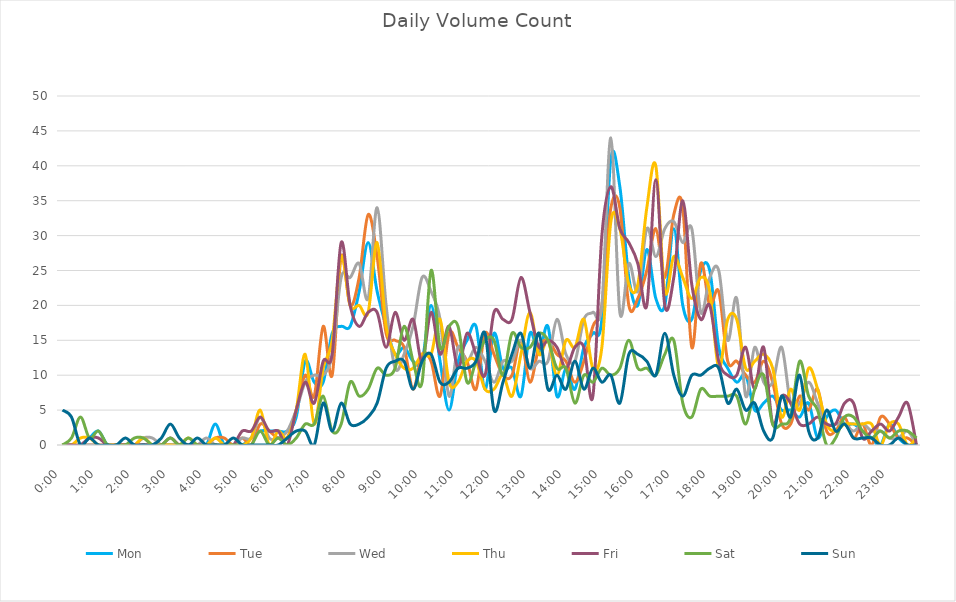
| Category | Mon | Tue | Wed | Thu | Fri | Sat | Sun |
|---|---|---|---|---|---|---|---|
| 0.0 | 0 | 0 | 0 | 0 | 0 | 0 | 5 |
| 0.010416666666666666 | 0 | 0 | 0 | 0 | 0 | 1 | 4 |
| 0.020833333333333332 | 0 | 0 | 0 | 1 | 0 | 4 | 0 |
| 0.03125 | 1 | 0 | 0 | 1 | 1 | 1 | 1 |
| 0.041666666666666664 | 2 | 0 | 0 | 0 | 1 | 2 | 0 |
| 0.05208333333333333 | 0 | 0 | 0 | 0 | 0 | 0 | 0 |
| 0.06249999999999999 | 0 | 0 | 0 | 0 | 0 | 0 | 0 |
| 0.07291666666666666 | 0 | 0 | 0 | 0 | 0 | 0 | 1 |
| 0.08333333333333333 | 0 | 0 | 0 | 0 | 0 | 1 | 0 |
| 0.09375 | 0 | 0 | 1 | 1 | 0 | 1 | 0 |
| 0.10416666666666667 | 0 | 0 | 1 | 0 | 0 | 0 | 0 |
| 0.11458333333333334 | 0 | 0 | 0 | 0 | 0 | 0 | 1 |
| 0.125 | 0 | 0 | 0 | 0 | 1 | 1 | 3 |
| 0.13541666666666666 | 0 | 0 | 0 | 0 | 0 | 0 | 1 |
| 0.14583333333333331 | 0 | 0 | 0 | 1 | 0 | 1 | 0 |
| 0.15624999999999997 | 0 | 0 | 0 | 0 | 0 | 0 | 1 |
| 0.16666666666666663 | 0 | 0 | 1 | 0 | 0 | 0 | 0 |
| 0.1770833333333333 | 3 | 1 | 0 | 1 | 0 | 0 | 0 |
| 0.18749999999999994 | 0 | 1 | 0 | 0 | 0 | 0 | 0 |
| 0.1979166666666666 | 0 | 0 | 0 | 0 | 0 | 0 | 1 |
| 0.20833333333333326 | 0 | 1 | 1 | 0 | 2 | 0 | 0 |
| 0.21874999999999992 | 1 | 0 | 1 | 1 | 2 | 0 | 0 |
| 0.22916666666666657 | 2 | 3 | 4 | 5 | 4 | 2 | 0 |
| 0.23958333333333323 | 2 | 2 | 1 | 0 | 2 | 0 | 0 |
| 0.2499999999999999 | 2 | 1 | 1 | 2 | 2 | 1 | 0 |
| 0.2604166666666666 | 2 | 1 | 2 | 1 | 0 | 0 | 1 |
| 0.27083333333333326 | 4 | 5 | 5 | 5 | 5 | 1 | 2 |
| 0.28124999999999994 | 12 | 10 | 9 | 13 | 9 | 3 | 2 |
| 0.29166666666666663 | 9 | 7 | 10 | 3 | 6 | 3 | 0 |
| 0.3020833333333333 | 9 | 17 | 10 | 11 | 12 | 7 | 6 |
| 0.3125 | 16 | 10 | 13 | 15 | 13 | 2 | 2 |
| 0.3229166666666667 | 17 | 27 | 24 | 27 | 29 | 3 | 6 |
| 0.33333333333333337 | 17 | 20 | 24 | 20 | 20 | 9 | 3 |
| 0.34375000000000006 | 22 | 24 | 26 | 20 | 17 | 7 | 3 |
| 0.35416666666666674 | 29 | 33 | 21 | 19 | 19 | 8 | 4 |
| 0.3645833333333334 | 22 | 27 | 34 | 29 | 19 | 11 | 6 |
| 0.3750000000000001 | 17 | 16 | 20 | 17 | 14 | 10 | 11 |
| 0.3854166666666668 | 13 | 15 | 11 | 13 | 19 | 11 | 12 |
| 0.3958333333333335 | 14 | 14 | 13 | 11 | 15 | 17 | 12 |
| 0.40625000000000017 | 12 | 8 | 17 | 11 | 18 | 12 | 8 |
| 0.41666666666666685 | 12 | 13 | 24 | 13 | 12 | 9 | 12 |
| 0.4270833333333333 | 20 | 12 | 22 | 13 | 19 | 25 | 13 |
| 0.4375000000000002 | 12 | 7 | 18 | 18 | 13 | 14 | 9 |
| 0.4479166666666669 | 5 | 16 | 7 | 9 | 17 | 17 | 9 |
| 0.4583333333333333 | 12 | 14 | 14 | 9 | 11 | 17 | 11 |
| 0.4687500000000003 | 15 | 12 | 12 | 12 | 16 | 9 | 11 |
| 0.47916666666666696 | 17 | 8 | 14 | 12 | 13 | 12 | 12 |
| 0.4895833333333333 | 8 | 16 | 12 | 8 | 10 | 15 | 16 |
| 0.5000000000000003 | 16 | 13 | 9 | 8 | 19 | 15 | 5 |
| 0.510416666666667 | 11 | 10 | 12 | 10 | 18 | 10 | 9 |
| 0.5208333333333334 | 11 | 10 | 12 | 7 | 18 | 16 | 13 |
| 0.5312500000000002 | 7 | 15 | 15 | 13 | 24 | 14 | 16 |
| 0.5416666666666669 | 16 | 9 | 11 | 19 | 19 | 14 | 11 |
| 0.5520833333333335 | 13 | 14 | 12 | 13 | 14 | 16 | 16 |
| 0.5625000000000001 | 17 | 15 | 12 | 15 | 15 | 15 | 8 |
| 0.5729166666666667 | 7 | 13 | 18 | 10 | 14 | 11 | 10 |
| 0.5833333333333334 | 11 | 12 | 13 | 15 | 11 | 11 | 8 |
| 0.59375 | 8 | 9 | 12 | 14 | 14 | 6 | 12 |
| 0.6041666666666666 | 14 | 12 | 18 | 18 | 14 | 10 | 8 |
| 0.6145833333333333 | 16 | 17 | 19 | 11 | 7 | 9 | 11 |
| 0.6249999999999999 | 18 | 20 | 20 | 14 | 30 | 11 | 9 |
| 0.6354166666666665 | 41 | 34 | 44 | 32 | 37 | 10 | 10 |
| 0.6458333333333331 | 37 | 34 | 19 | 31 | 31 | 11 | 6 |
| 0.6562499999999998 | 24 | 20 | 26 | 23 | 29 | 15 | 13 |
| 0.6666666666666666 | 20 | 21 | 22 | 23 | 26 | 11 | 13 |
| 0.677083333333333 | 28 | 25 | 31 | 34 | 20 | 11 | 12 |
| 0.6874999999999997 | 21 | 31 | 27 | 40 | 38 | 10 | 10 |
| 0.6979166666666666 | 20 | 24 | 31 | 22 | 20 | 13 | 16 |
| 0.7083333333333329 | 31 | 33 | 32 | 27 | 24 | 15 | 10 |
| 0.7187499999999996 | 20 | 34 | 29 | 24 | 35 | 6 | 7 |
| 0.7291666666666666 | 18 | 14 | 31 | 21 | 23 | 4 | 10 |
| 0.7395833333333328 | 25 | 26 | 19 | 24 | 18 | 8 | 10 |
| 0.75 | 25 | 20 | 24 | 22 | 20 | 7 | 11 |
| 0.7604166666666666 | 14 | 22 | 25 | 11 | 12 | 7 | 11 |
| 0.7708333333333327 | 11 | 12 | 15 | 18 | 10 | 7 | 6 |
| 0.78125 | 9 | 12 | 21 | 18 | 10 | 7 | 8 |
| 0.7916666666666666 | 10 | 10 | 7 | 11 | 14 | 3 | 5 |
| 0.8020833333333326 | 5 | 9 | 14 | 12 | 8 | 8 | 6 |
| 0.8125 | 6 | 12 | 9 | 13 | 14 | 10 | 2 |
| 0.8229166666666666 | 7 | 9 | 9 | 11 | 3 | 3 | 1 |
| 0.8333333333333334 | 5 | 3 | 14 | 4 | 7 | 3 | 7 |
| 0.84375 | 5 | 3 | 6 | 8 | 6 | 4 | 4 |
| 0.8541666666666666 | 4 | 7 | 6 | 5 | 3 | 12 | 10 |
| 0.8645833333333334 | 6 | 5 | 9 | 11 | 3 | 7 | 2 |
| 0.875 | 1 | 8 | 6 | 8 | 4 | 5 | 1 |
| 0.8854166666666666 | 4 | 2 | 3 | 3 | 3 | 0 | 5 |
| 0.8958333333333334 | 5 | 2 | 3 | 2 | 3 | 1 | 2 |
| 0.90625 | 3 | 4 | 3 | 3 | 6 | 4 | 3 |
| 0.9166666666666666 | 3 | 1 | 2 | 3 | 6 | 4 | 1 |
| 0.9270833333333334 | 2 | 3 | 3 | 3 | 1 | 2 | 1 |
| 0.9375 | 1 | 0 | 2 | 3 | 2 | 1 | 1 |
| 0.9479166666666666 | 0 | 4 | 2 | 0 | 3 | 2 | 0 |
| 0.9583333333333334 | 3 | 3 | 1 | 3 | 2 | 1 | 0 |
| 0.96875 | 1 | 1 | 1 | 3 | 4 | 2 | 1 |
| 0.9791666666666666 | 0 | 1 | 2 | 0 | 6 | 2 | 0 |
| 0.9895833333333334 | 0 | 0 | 0 | 1 | 0 | 1 | 0 |